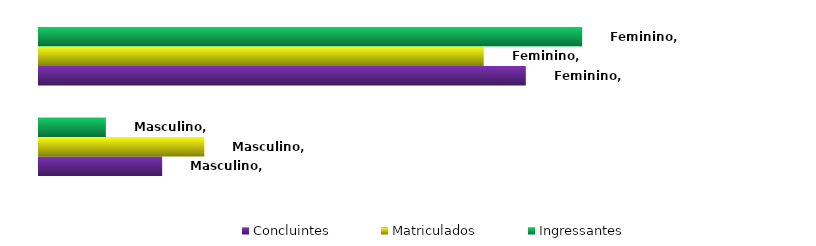
| Category | Concluintes | Matriculados | Ingressantes |
|---|---|---|---|
| Masculino | 0.202 | 0.271 | 0.11 |
| Feminino | 0.798 | 0.729 | 0.89 |